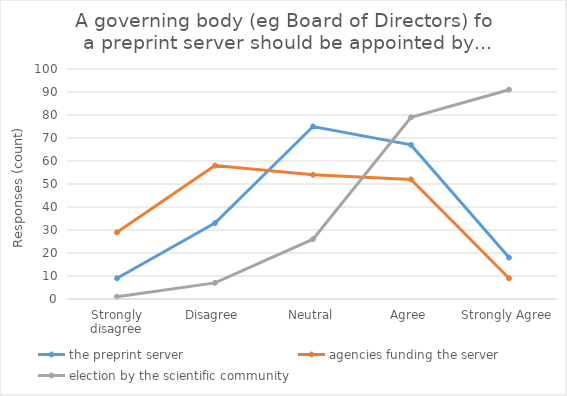
| Category | the preprint server | agencies funding the server | election by the scientific community |
|---|---|---|---|
| Strongly disagree | 9 | 29 | 1 |
| Disagree | 33 | 58 | 7 |
| Neutral | 75 | 54 | 26 |
| Agree | 67 | 52 | 79 |
| Strongly Agree | 18 | 9 | 91 |